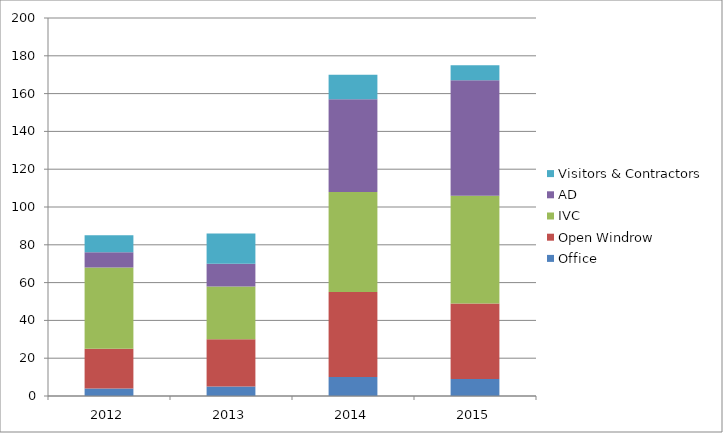
| Category | Office | Open Windrow | IVC | AD | Visitors & Contractors |
|---|---|---|---|---|---|
| 2012.0 | 4 | 21 | 43 | 8 | 9 |
| 2013.0 | 5 | 25 | 28 | 12 | 16 |
| 2014.0 | 10 | 45 | 53 | 49 | 13 |
| 2015.0 | 9 | 40 | 57 | 61 | 8 |